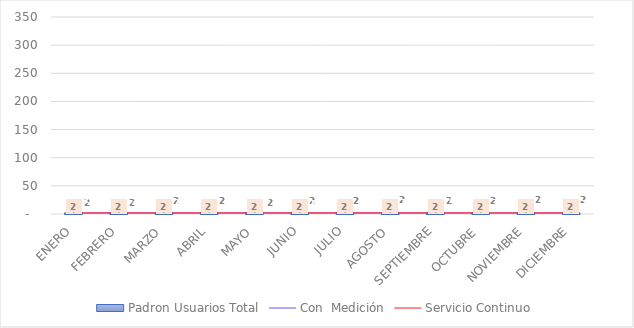
| Category | Padron Usuarios Total |
|---|---|
| ENERO | 1.973 |
| FEBRERO | 1.976 |
| MARZO | 1.973 |
| ABRIL | 1.975 |
| MAYO | 1.983 |
| JUNIO | 1.984 |
| JULIO | 1.997 |
| AGOSTO | 2.009 |
| SEPTIEMBRE | 2.021 |
| OCTUBRE | 2.021 |
| NOVIEMBRE | 2.026 |
| DICIEMBRE | 2.031 |